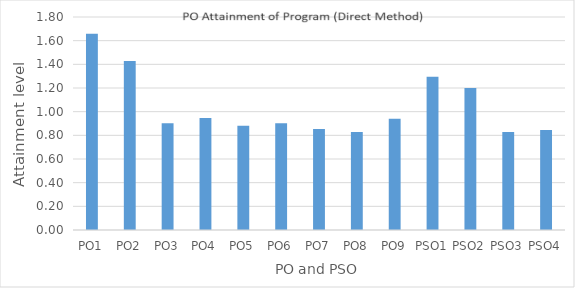
| Category | Series 0 |
|---|---|
| PO1 | 1.658 |
| PO2 | 1.428 |
| PO3 | 0.901 |
| PO4 | 0.947 |
| PO5 | 0.882 |
| PO6 | 0.901 |
| PO7 | 0.853 |
| PO8 | 0.829 |
| PO9 | 0.941 |
| PSO1 | 1.294 |
| PSO2 | 1.201 |
| PSO3 | 0.829 |
| PSO4 | 0.845 |